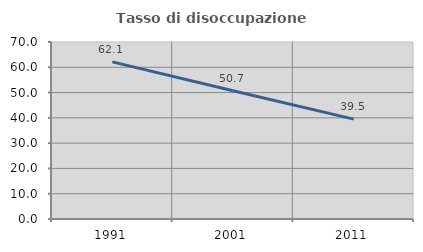
| Category | Tasso di disoccupazione giovanile  |
|---|---|
| 1991.0 | 62.145 |
| 2001.0 | 50.707 |
| 2011.0 | 39.5 |